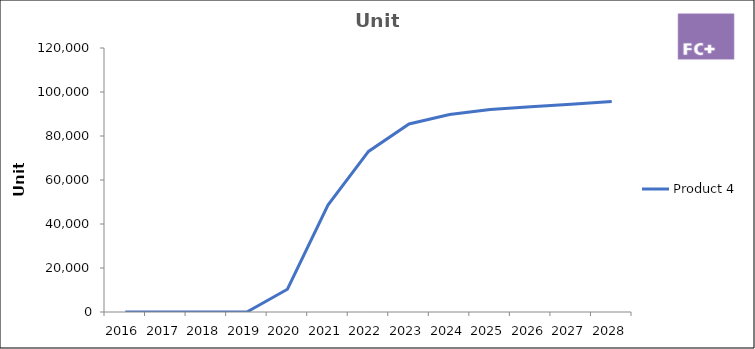
| Category | Product 4 |
|---|---|
| 2016.0 | 0 |
| 2017.0 | 0 |
| 2018.0 | 0 |
| 2019.0 | 0 |
| 2020.0 | 10342.974 |
| 2021.0 | 48610.44 |
| 2022.0 | 72975.282 |
| 2023.0 | 85489.937 |
| 2024.0 | 89754.528 |
| 2025.0 | 92015.089 |
| 2026.0 | 93246.994 |
| 2027.0 | 94478.898 |
| 2028.0 | 95710.803 |